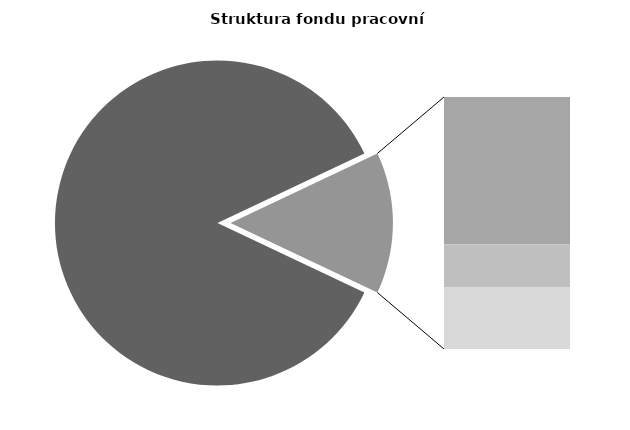
| Category | Series 0 |
|---|---|
| Průměrná měsíční odpracovaná doba bez přesčasu | 147.39 |
| Dovolená | 14.114 |
| Nemoc | 4.131 |
| Jiné | 5.89 |